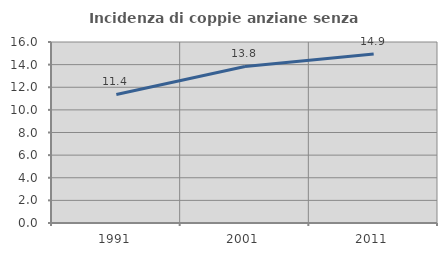
| Category | Incidenza di coppie anziane senza figli  |
|---|---|
| 1991.0 | 11.361 |
| 2001.0 | 13.838 |
| 2011.0 | 14.929 |